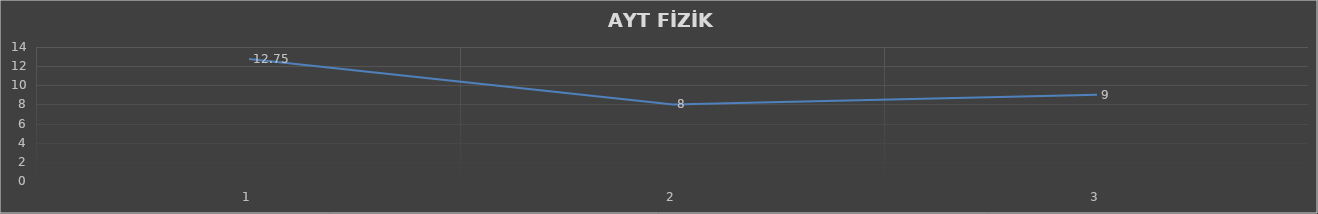
| Category | Series 0 |
|---|---|
| 0 | 12.75 |
| 1 | 8 |
| 2 | 9 |